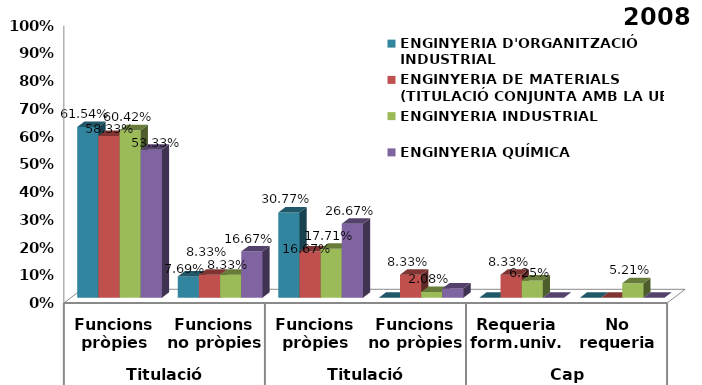
| Category | ENGINYERIA D'ORGANITZACIÓ INDUSTRIAL | ENGINYERIA DE MATERIALS (TITULACIÓ CONJUNTA AMB LA UB) | ENGINYERIA INDUSTRIAL | ENGINYERIA QUÍMICA |
|---|---|---|---|---|
| 0 | 0.615 | 0.583 | 0.604 | 0.533 |
| 1 | 0.077 | 0.083 | 0.083 | 0.167 |
| 2 | 0.308 | 0.167 | 0.177 | 0.267 |
| 3 | 0 | 0.083 | 0.021 | 0.033 |
| 4 | 0 | 0.083 | 0.062 | 0 |
| 5 | 0 | 0 | 0.052 | 0 |